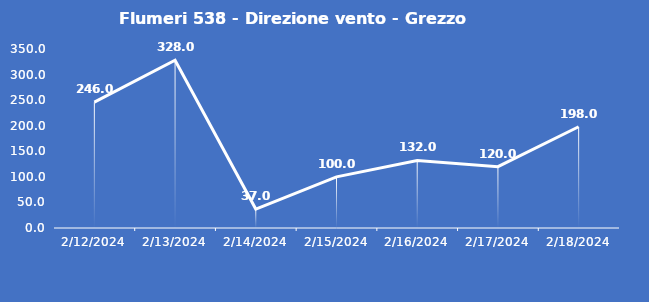
| Category | Flumeri 538 - Direzione vento - Grezzo (°N) |
|---|---|
| 2/12/24 | 246 |
| 2/13/24 | 328 |
| 2/14/24 | 37 |
| 2/15/24 | 100 |
| 2/16/24 | 132 |
| 2/17/24 | 120 |
| 2/18/24 | 198 |